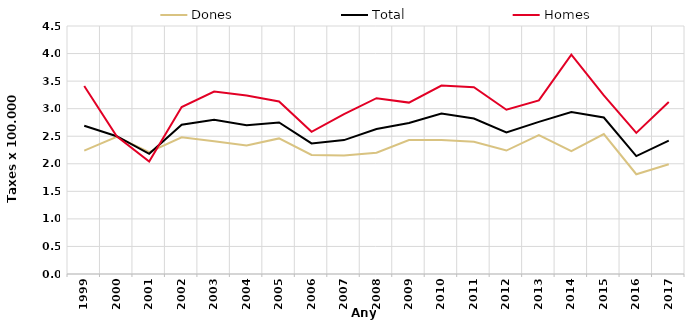
| Category | Dones | Total | Homes |
|---|---|---|---|
| 1999.0 | 2.24 | 2.69 | 3.41 |
| 2000.0 | 2.49 | 2.5 | 2.5 |
| 2001.0 | 2.21 | 2.18 | 2.04 |
| 2002.0 | 2.48 | 2.71 | 3.03 |
| 2003.0 | 2.41 | 2.8 | 3.31 |
| 2004.0 | 2.33 | 2.7 | 3.24 |
| 2005.0 | 2.46 | 2.75 | 3.13 |
| 2006.0 | 2.16 | 2.37 | 2.58 |
| 2007.0 | 2.15 | 2.43 | 2.9 |
| 2008.0 | 2.2 | 2.63 | 3.19 |
| 2009.0 | 2.43 | 2.74 | 3.11 |
| 2010.0 | 2.43 | 2.91 | 3.42 |
| 2011.0 | 2.4 | 2.82 | 3.39 |
| 2012.0 | 2.24 | 2.57 | 2.98 |
| 2013.0 | 2.52 | 2.76 | 3.15 |
| 2014.0 | 2.23 | 2.94 | 3.98 |
| 2015.0 | 2.54 | 2.84 | 3.24 |
| 2016.0 | 1.81 | 2.14 | 2.56 |
| 2017.0 | 1.99 | 2.42 | 3.12 |